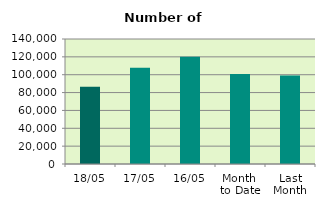
| Category | Series 0 |
|---|---|
| 18/05 | 86502 |
| 17/05 | 107740 |
| 16/05 | 119982 |
| Month 
to Date | 100867.077 |
| Last
Month | 99222.444 |